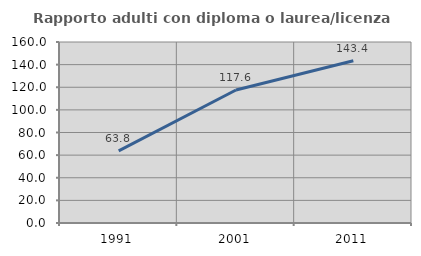
| Category | Rapporto adulti con diploma o laurea/licenza media  |
|---|---|
| 1991.0 | 63.768 |
| 2001.0 | 117.576 |
| 2011.0 | 143.382 |